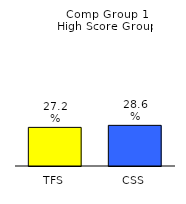
| Category | Series 0 |
|---|---|
| TFS | 0.272 |
| CSS | 0.286 |